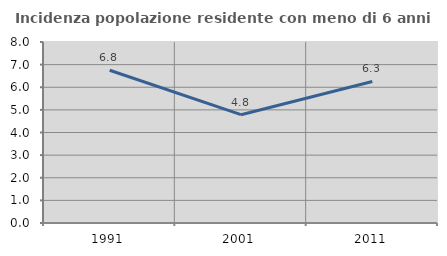
| Category | Incidenza popolazione residente con meno di 6 anni |
|---|---|
| 1991.0 | 6.753 |
| 2001.0 | 4.787 |
| 2011.0 | 6.257 |